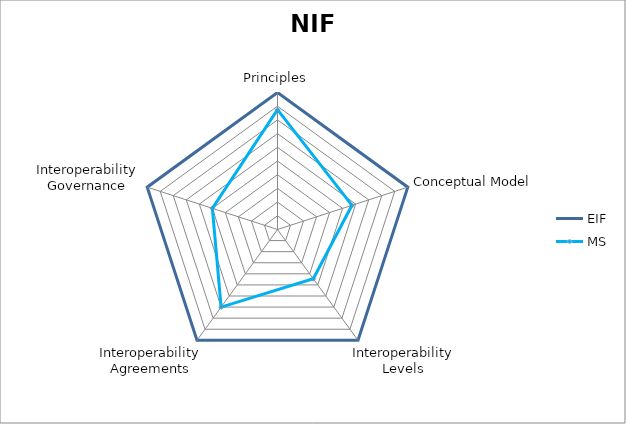
| Category | EIF | MS |
|---|---|---|
| Principles | 1 | 0.875 |
| Conceptual Model | 1 | 0.571 |
| Interoperability Levels | 1 | 0.444 |
| Interoperability Agreements | 1 | 0.7 |
| Interoperability Governance | 1 | 0.5 |